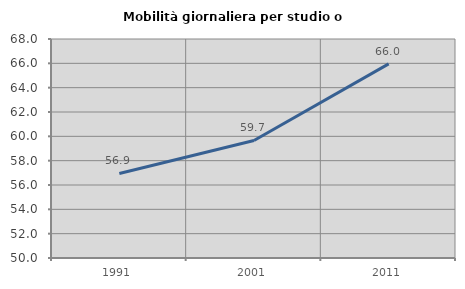
| Category | Mobilità giornaliera per studio o lavoro |
|---|---|
| 1991.0 | 56.95 |
| 2001.0 | 59.659 |
| 2011.0 | 65.957 |